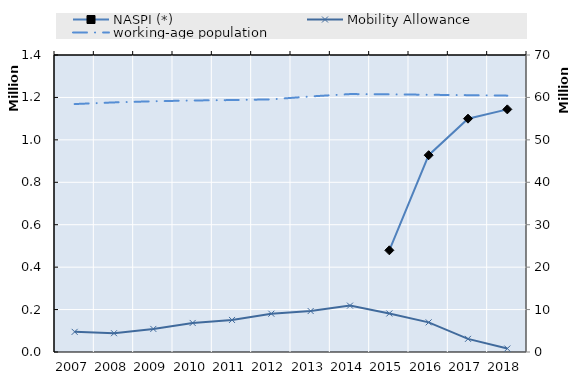
| Category | NASPI (*) | Mobility Allowance |
|---|---|---|
| 2007.0 | 0 | 95006 |
| 2008.0 | 0 | 88556 |
| 2009.0 | 0 | 108812 |
| 2010.0 | 0 | 136977.917 |
| 2011.0 | 0 | 151131.5 |
| 2012.0 | 0 | 180486.5 |
| 2013.0 | 0 | 193103 |
| 2014.0 | 0 | 218664 |
| 2015.0 | 479266 | 181618 |
| 2016.0 | 927673 | 139747 |
| 2017.0 | 1099912 | 61995 |
| 2018.0 | 1143748 | 16348 |